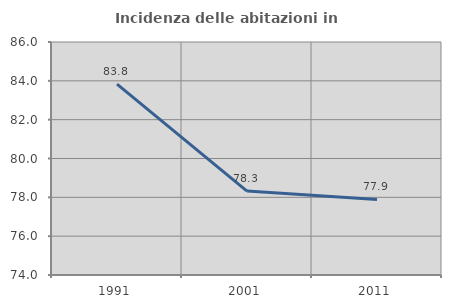
| Category | Incidenza delle abitazioni in proprietà  |
|---|---|
| 1991.0 | 83.826 |
| 2001.0 | 78.322 |
| 2011.0 | 77.893 |